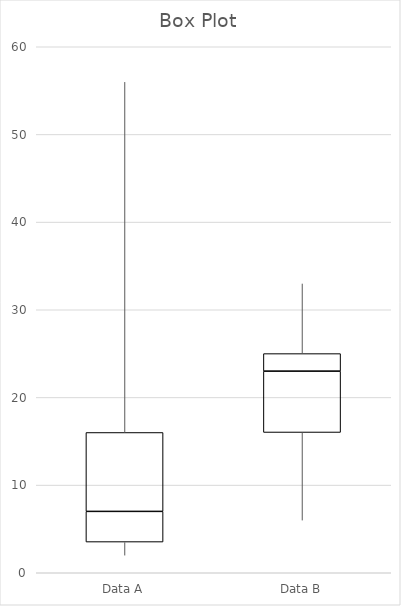
| Category | Series 0 | Series 1 | Series 2 | Series 3 | Series 4 |
|---|---|---|---|---|---|
| Data A | 2 | 1.5 | 3.5 | 9 | 40 |
| Data B | 6 | 10 | 7 | 2 | 8 |